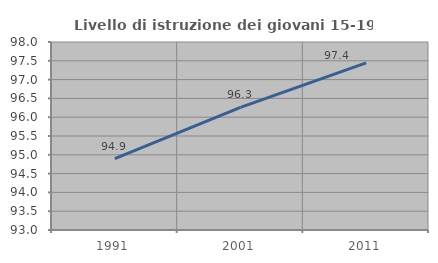
| Category | Livello di istruzione dei giovani 15-19 anni |
|---|---|
| 1991.0 | 94.896 |
| 2001.0 | 96.262 |
| 2011.0 | 97.444 |